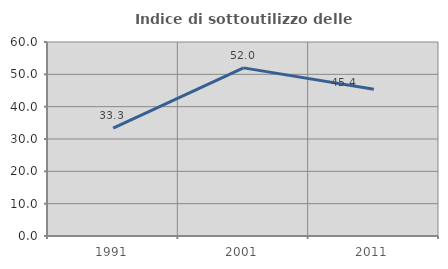
| Category | Indice di sottoutilizzo delle abitazioni  |
|---|---|
| 1991.0 | 33.333 |
| 2001.0 | 52 |
| 2011.0 | 45.408 |